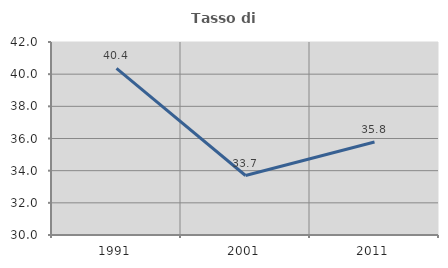
| Category | Tasso di occupazione   |
|---|---|
| 1991.0 | 40.357 |
| 2001.0 | 33.699 |
| 2011.0 | 35.786 |